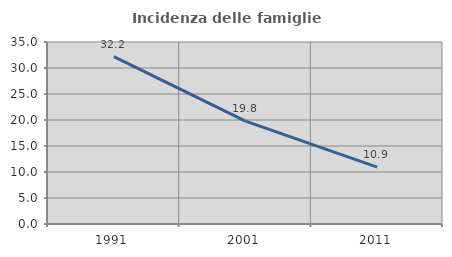
| Category | Incidenza delle famiglie numerose |
|---|---|
| 1991.0 | 32.176 |
| 2001.0 | 19.778 |
| 2011.0 | 10.947 |